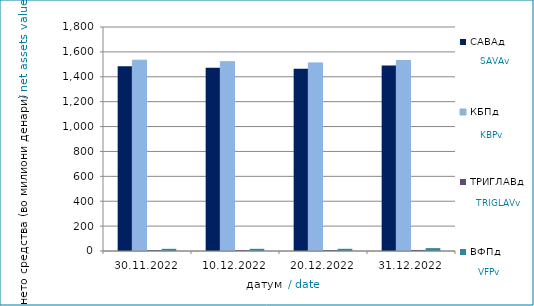
| Category | САВАд | КБПд | ТРИГЛАВд | ВФПд |
|---|---|---|---|---|
| 2022-11-30 | 1484.027 | 1533.083 | 7.255 | 17.524 |
| 2022-12-10 | 1472.198 | 1521.233 | 7.261 | 17.593 |
| 2022-12-20 | 1464.019 | 1511.566 | 7.348 | 17.681 |
| 2022-12-31 | 1490.031 | 1530.435 | 8.55 | 23.177 |